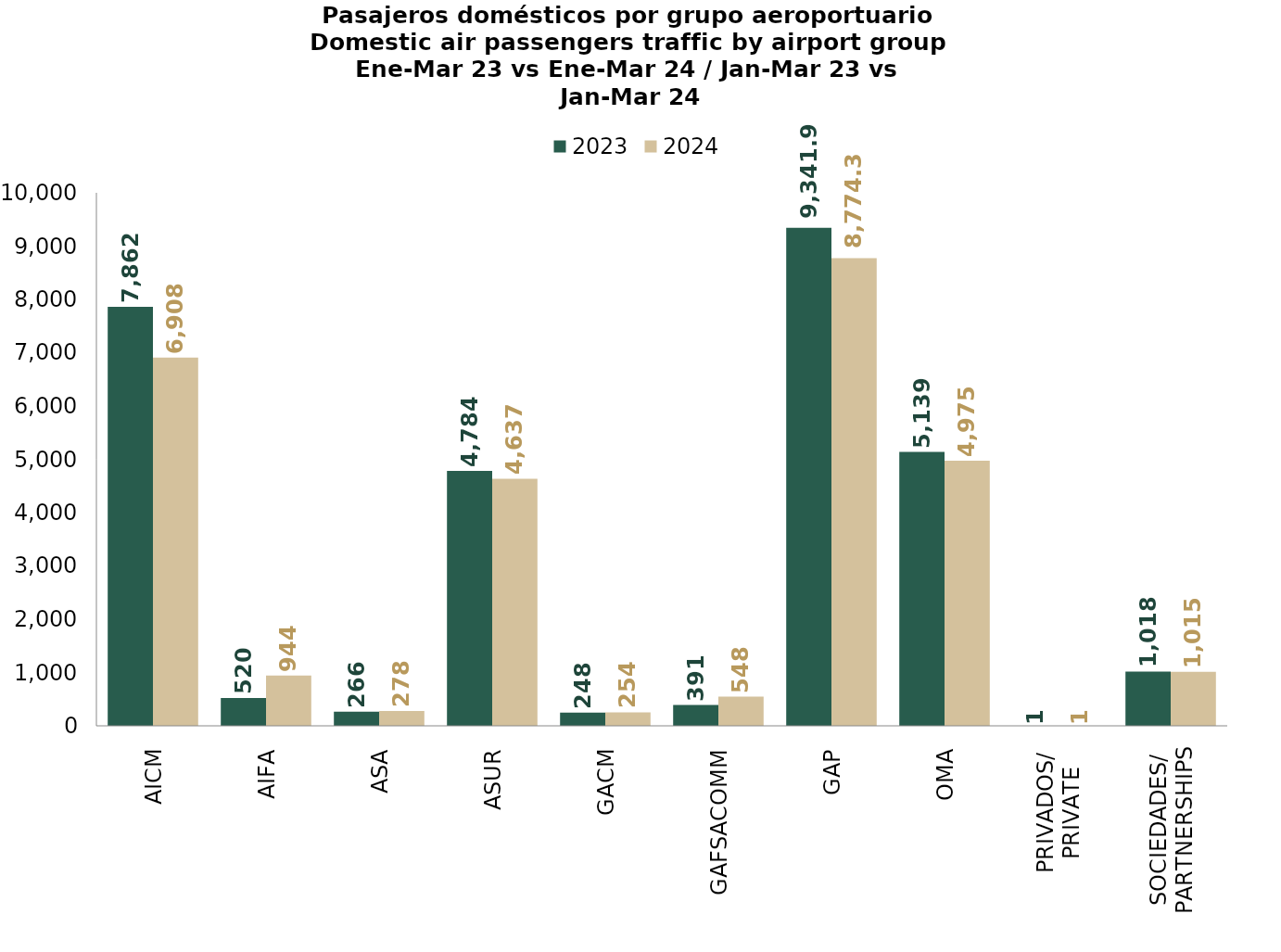
| Category | 2023 | 2024 |
|---|---|---|
| AICM | 7861.747 | 6908.41 |
| AIFA | 519.62 | 944.039 |
| ASA | 266.283 | 278.064 |
| ASUR | 4784.188 | 4636.819 |
| GACM | 248.121 | 254.347 |
| GAFSACOMM | 390.968 | 547.599 |
| GAP | 9341.928 | 8774.332 |
| OMA | 5138.964 | 4975.382 |
| PRIVADOS/
PRIVATE | 0.867 | 0.865 |
| SOCIEDADES/
PARTNERSHIPS | 1017.611 | 1014.67 |